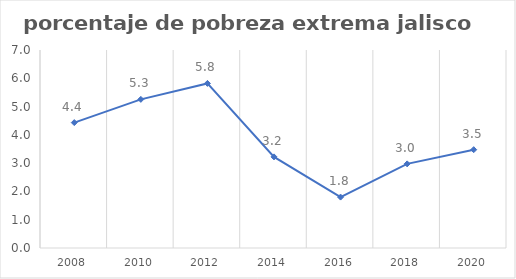
| Category | Series 0 |
|---|---|
| 2008.0 | 4.433 |
| 2010.0 | 5.255 |
| 2012.0 | 5.819 |
| 2014.0 | 3.221 |
| 2016.0 | 1.8 |
| 2018.0 | 2.974 |
| 2020.0 | 3.476 |